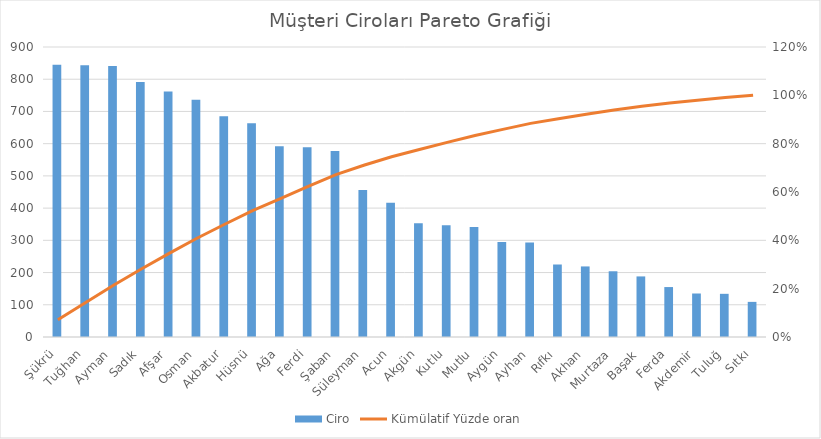
| Category | Ciro |
|---|---|
| Şükrü | 845 |
| Tuğhan | 843 |
| Ayman | 841 |
| Sadık | 791 |
| Afşar | 762 |
| Osman | 736 |
| Akbatur | 685 |
| Hüsnü | 663 |
| Ağa | 592 |
| Ferdi | 589 |
| Şaban | 577 |
| Süleyman | 456 |
| Acun | 417 |
| Akgün | 353 |
| Kutlu | 347 |
| Mutlu | 341 |
| Aygün | 295 |
| Ayhan | 293 |
| Rıfkı | 225 |
| Akhan | 219 |
| Murtaza | 204 |
| Başak | 188 |
| Ferda | 155 |
| Akdemir | 135 |
| Tuluğ | 134 |
| Sıtkı | 109 |